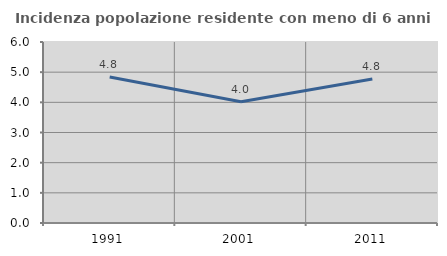
| Category | Incidenza popolazione residente con meno di 6 anni |
|---|---|
| 1991.0 | 4.837 |
| 2001.0 | 4.022 |
| 2011.0 | 4.772 |